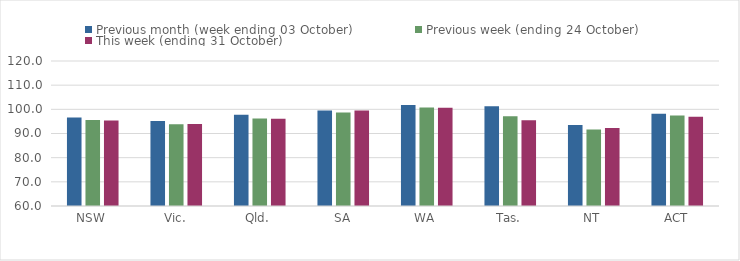
| Category | Previous month (week ending 03 October) | Previous week (ending 24 October) | This week (ending 31 October) |
|---|---|---|---|
| NSW | 96.58 | 95.58 | 95.34 |
| Vic. | 95.14 | 93.81 | 93.88 |
| Qld. | 97.71 | 96.16 | 96.1 |
| SA | 99.47 | 98.71 | 99.5 |
| WA | 101.75 | 100.79 | 100.7 |
| Tas. | 101.32 | 97.15 | 95.48 |
| NT | 93.52 | 91.65 | 92.32 |
| ACT | 98.17 | 97.49 | 96.91 |